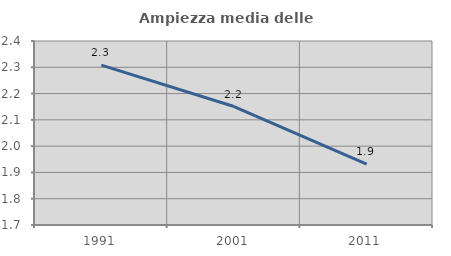
| Category | Ampiezza media delle famiglie |
|---|---|
| 1991.0 | 2.308 |
| 2001.0 | 2.151 |
| 2011.0 | 1.932 |